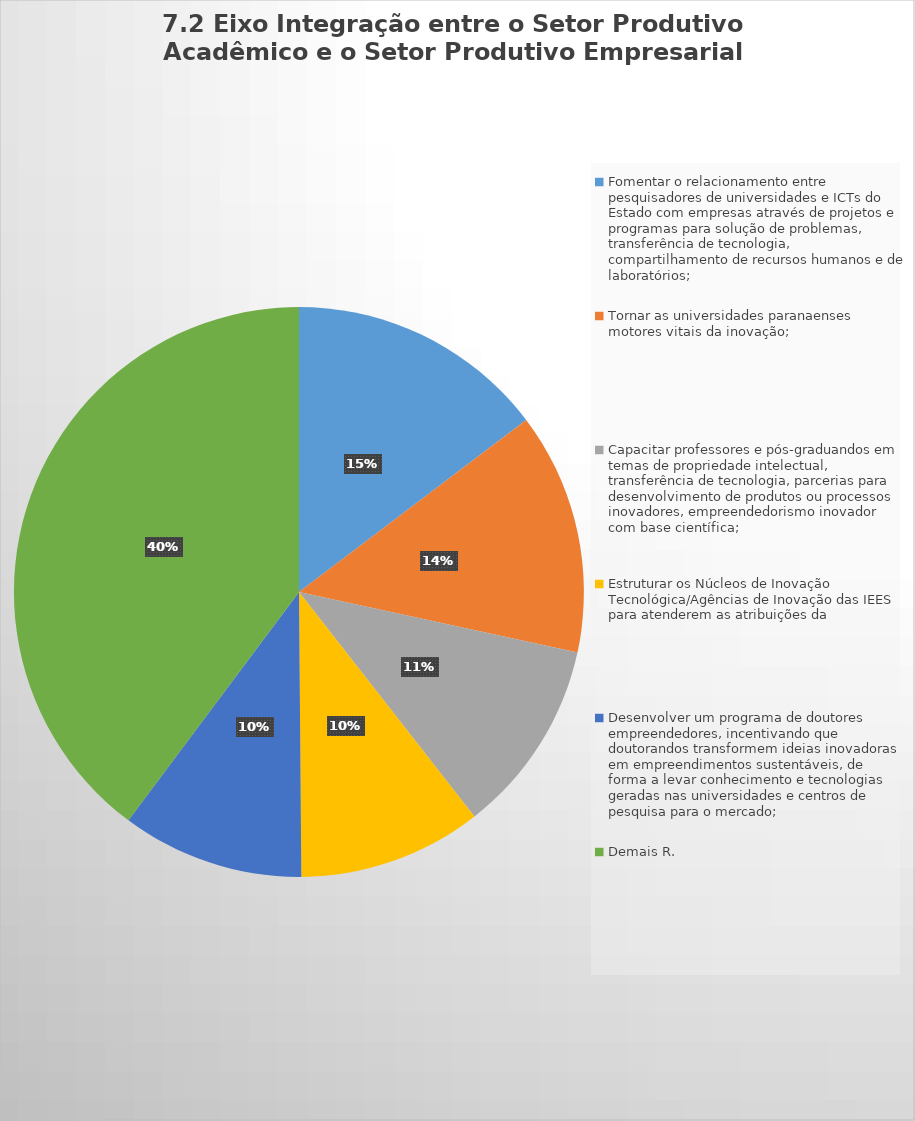
| Category | Series 0 |
|---|---|
| Fomentar o relacionamento entre pesquisadores de universidades e ICTs do Estado com empresas através de projetos e programas para solução de problemas, transferência de tecnologia, compartilhamento de recursos humanos e de laboratórios; | 169 |
| Tornar as universidades paranaenses motores vitais da inovação; | 158 |
| Capacitar professores e pós-graduandos em temas de propriedade intelectual, transferência de tecnologia, parcerias para desenvolvimento de produtos ou processos inovadores, empreendedorismo inovador com base científica; | 127 |
| Estruturar os Núcleos de Inovação Tecnológica/Agências de Inovação das IEES para atenderem as atribuições da | 120 |
| Desenvolver um programa de doutores empreendedores, incentivando que doutorandos transformem ideias inovadoras em empreendimentos sustentáveis, de forma a levar conhecimento e tecnologias geradas nas universidades e centros de pesquisa para o mercado; | 119 |
| Demais R. | 458 |